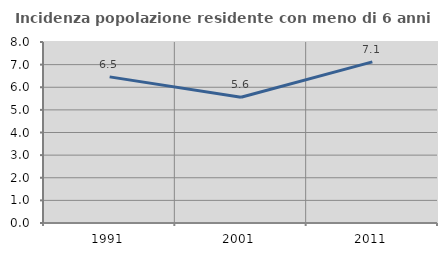
| Category | Incidenza popolazione residente con meno di 6 anni |
|---|---|
| 1991.0 | 6.459 |
| 2001.0 | 5.556 |
| 2011.0 | 7.119 |